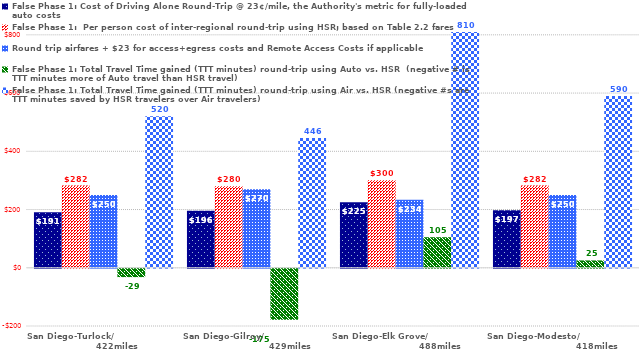
| Category | False Phase 1: Cost of Driving Alone Round-Trip @ 23¢/mile, the Authority's metric for fully-loaded auto costs | False Phase 1:  Per person cost of inter-regional round-trip using HSR; based on Table 2.2 fares | Round trip airfares + $23 for access+egress costs and Remote Access Costs if applicable | False Phase 1: Total Travel Time gained (TTT minutes) round-trip using Auto vs. HSR  (negative # is TTT minutes more of Auto travel than HSR travel) | False Phase 1: Total Travel Time gained (TTT minutes) round-trip using Air vs. HSR (negative #s are TTT minutes saved by HSR travelers over Air travelers) |
|---|---|---|---|---|---|
| San Diego-Turlock/                                 422miles | 190.9 | 282.3 | 250 | -28.7 | 520 |
|  San Diego-Gilroy/                                               429miles | 195.96 | 280.3 | 270 | -175.2 | 446 |
| San Diego-Elk Grove/                                         488miles | 225.4 | 300.3 | 234 | 104.9 | 810 |
| San Diego-Modesto/                                            418miles | 197.34 | 282.3 | 250 | 25.2 | 590 |